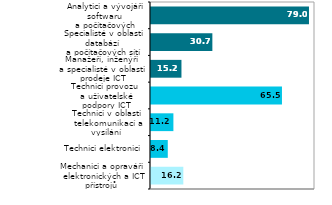
| Category | Series 0 |
|---|---|
| Mechanici a opraváři
 elektronických a ICT přístrojů | 16.159 |
| Technici elektronici | 8.388 |
| Technici v oblasti
 telekomunikací a vysílání | 11.198 |
| Technici provozu 
a uživatelské podpory ICT | 65.484 |
| Manažeři, inženýři 
a specialisté v oblasti prodeje ICT | 15.228 |
| Specialisté v oblasti databází 
a počítačových sítí | 30.681 |
| Analytici a vývojáři softwaru 
a počítačových aplikací | 78.991 |